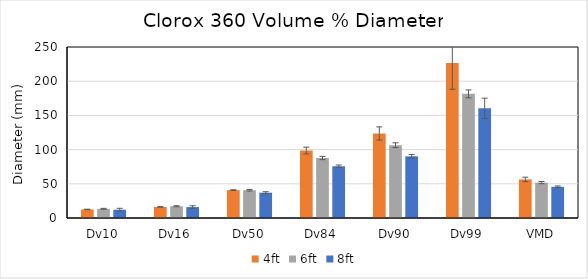
| Category | 4ft | 6ft | 8ft |
|---|---|---|---|
| Dv10 | 12.505 | 13.435 | 12.127 |
| Dv16 | 16.144 | 17.188 | 15.963 |
| Dv50 | 40.794 | 40.644 | 36.995 |
| Dv84 | 98.657 | 87.687 | 75.656 |
| Dv90 | 123.576 | 106.461 | 90.181 |
| Dv99 | 226.611 | 181.523 | 160.286 |
| VMD | 56.441 | 51.761 | 45.575 |